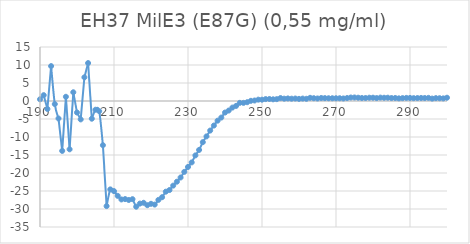
| Category | Series 0 |
|---|---|
| 300.0 | 0.913 |
| 299.0 | 0.728 |
| 298.0 | 0.774 |
| 297.0 | 0.793 |
| 296.0 | 0.671 |
| 295.0 | 0.87 |
| 294.0 | 0.821 |
| 293.0 | 0.839 |
| 292.0 | 0.823 |
| 291.0 | 0.79 |
| 290.0 | 0.85 |
| 289.0 | 0.861 |
| 288.0 | 0.801 |
| 287.0 | 0.737 |
| 286.0 | 0.835 |
| 285.0 | 0.826 |
| 284.0 | 0.914 |
| 283.0 | 0.899 |
| 282.0 | 0.943 |
| 281.0 | 0.816 |
| 280.0 | 0.918 |
| 279.0 | 0.915 |
| 278.0 | 0.83 |
| 277.0 | 0.832 |
| 276.0 | 0.915 |
| 275.0 | 0.978 |
| 274.0 | 0.968 |
| 273.0 | 0.828 |
| 272.0 | 0.706 |
| 271.0 | 0.767 |
| 270.0 | 0.761 |
| 269.0 | 0.762 |
| 268.0 | 0.765 |
| 267.0 | 0.797 |
| 266.0 | 0.832 |
| 265.0 | 0.704 |
| 264.0 | 0.776 |
| 263.0 | 0.885 |
| 262.0 | 0.615 |
| 261.0 | 0.674 |
| 260.0 | 0.593 |
| 259.0 | 0.687 |
| 258.0 | 0.644 |
| 257.0 | 0.713 |
| 256.0 | 0.651 |
| 255.0 | 0.816 |
| 254.0 | 0.516 |
| 253.0 | 0.468 |
| 252.0 | 0.558 |
| 251.0 | 0.529 |
| 250.0 | 0.366 |
| 249.0 | 0.374 |
| 248.0 | 0.135 |
| 247.0 | 0.048 |
| 246.0 | -0.335 |
| 245.0 | -0.52 |
| 244.0 | -0.516 |
| 243.0 | -1.363 |
| 242.0 | -1.829 |
| 241.0 | -2.654 |
| 240.0 | -3.208 |
| 239.0 | -4.601 |
| 238.0 | -5.464 |
| 237.0 | -6.818 |
| 236.0 | -8.21 |
| 235.0 | -9.83 |
| 234.0 | -11.433 |
| 233.0 | -13.596 |
| 232.0 | -15.114 |
| 231.0 | -17.056 |
| 230.0 | -18.324 |
| 229.0 | -19.69 |
| 228.0 | -21.245 |
| 227.0 | -22.418 |
| 226.0 | -23.506 |
| 225.0 | -24.73 |
| 224.0 | -25.188 |
| 223.0 | -26.722 |
| 222.0 | -27.478 |
| 221.0 | -28.77 |
| 220.0 | -28.556 |
| 219.0 | -28.943 |
| 218.0 | -28.279 |
| 217.0 | -28.496 |
| 216.0 | -29.366 |
| 215.0 | -27.273 |
| 214.0 | -27.49 |
| 213.0 | -27.247 |
| 212.0 | -27.344 |
| 211.0 | -26.346 |
| 210.0 | -25.039 |
| 209.0 | -24.557 |
| 208.0 | -29.196 |
| 207.0 | -12.274 |
| 206.0 | -2.824 |
| 205.0 | -2.424 |
| 204.0 | -4.919 |
| 203.0 | 10.538 |
| 202.0 | 6.581 |
| 201.0 | -5.115 |
| 200.0 | -3.202 |
| 199.0 | 2.425 |
| 198.0 | -13.421 |
| 197.0 | 1.174 |
| 196.0 | -13.86 |
| 195.0 | -4.857 |
| 194.0 | -0.851 |
| 193.0 | 9.697 |
| 192.0 | -2.213 |
| 191.0 | 1.62 |
| 190.0 | 0.476 |